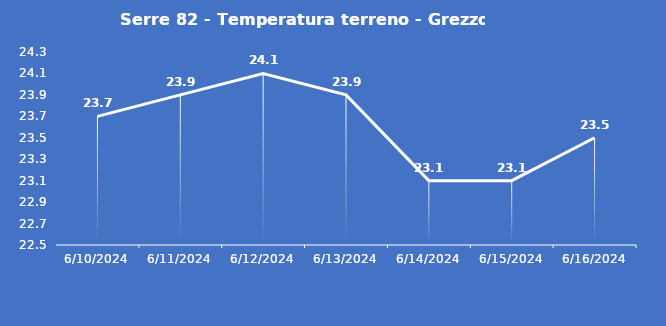
| Category | Serre 82 - Temperatura terreno - Grezzo (°C) |
|---|---|
| 6/10/24 | 23.7 |
| 6/11/24 | 23.9 |
| 6/12/24 | 24.1 |
| 6/13/24 | 23.9 |
| 6/14/24 | 23.1 |
| 6/15/24 | 23.1 |
| 6/16/24 | 23.5 |